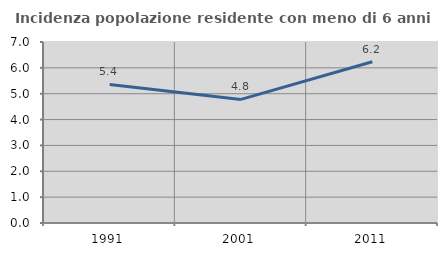
| Category | Incidenza popolazione residente con meno di 6 anni |
|---|---|
| 1991.0 | 5.36 |
| 2001.0 | 4.78 |
| 2011.0 | 6.238 |